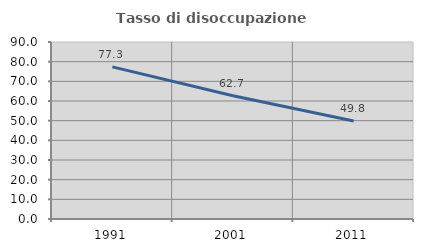
| Category | Tasso di disoccupazione giovanile  |
|---|---|
| 1991.0 | 77.342 |
| 2001.0 | 62.662 |
| 2011.0 | 49.825 |